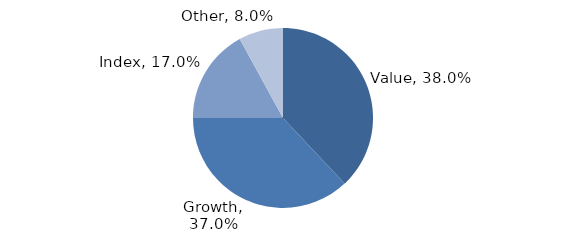
| Category | Investment Style |
|---|---|
| Value | 0.38 |
| Growth | 0.37 |
| Index | 0.17 |
| Other | 0.08 |